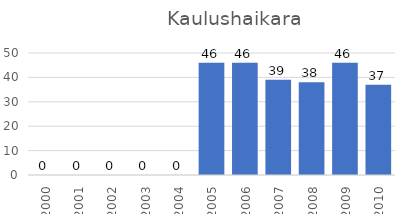
| Category | Series 0 |
|---|---|
| 2000.0 | 0 |
| 2001.0 | 0 |
| 2002.0 | 0 |
| 2003.0 | 0 |
| 2004.0 | 0 |
| 2005.0 | 46 |
| 2006.0 | 46 |
| 2007.0 | 39 |
| 2008.0 | 38 |
| 2009.0 | 46 |
| 2010.0 | 37 |